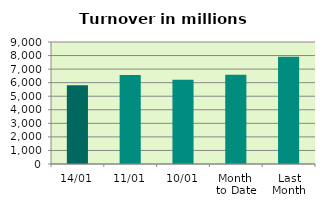
| Category | Series 0 |
|---|---|
| 14/01 | 5811.85 |
| 11/01 | 6560.235 |
| 10/01 | 6209.541 |
| Month 
to Date | 6576.755 |
| Last
Month | 7903.143 |